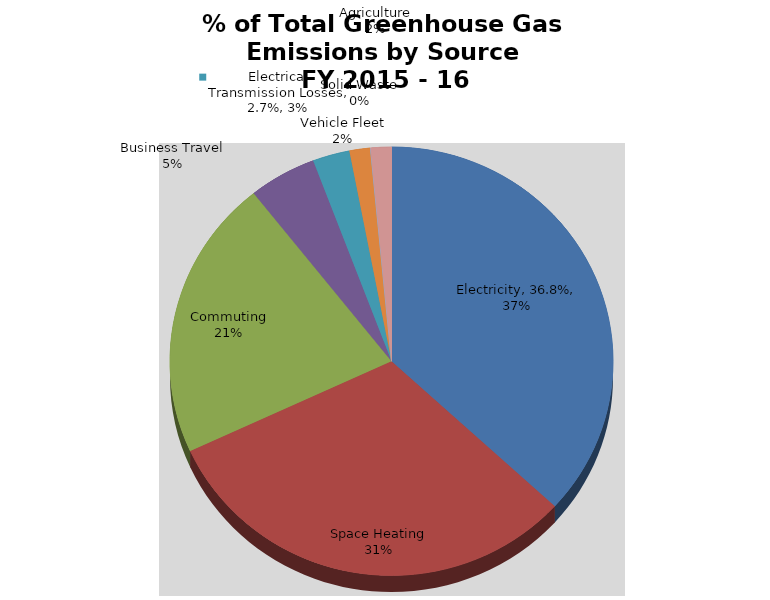
| Category | Series 0 |
|---|---|
| Electricity | 0.368 |
| Space Heating | 0.313 |
| Commuting | 0.212 |
| Business Travel | 0.049 |
| Electrical Transmission Losses | 0.027 |
| Vehicle Fleet | 0.015 |
| Solid Waste | 0 |
| Agriculture | 0.015 |